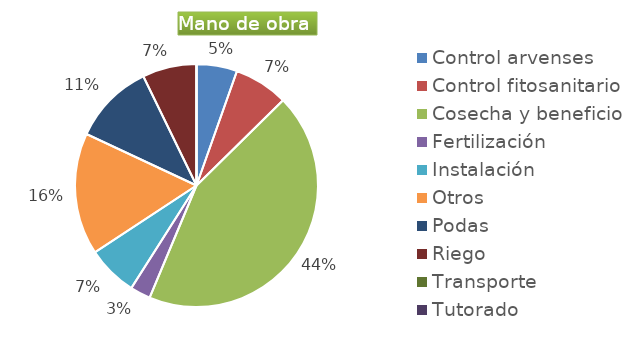
| Category | Series 0 |
|---|---|
| Control arvenses | 4055880 |
| Control fitosanitario | 5407840 |
| Cosecha y beneficio | 32750000 |
| Fertilización | 2027940 |
| Instalación | 5048351 |
| Otros | 12167640 |
| Podas | 8111760 |
| Riego | 5407840 |
| Transporte | 0 |
| Tutorado | 0 |